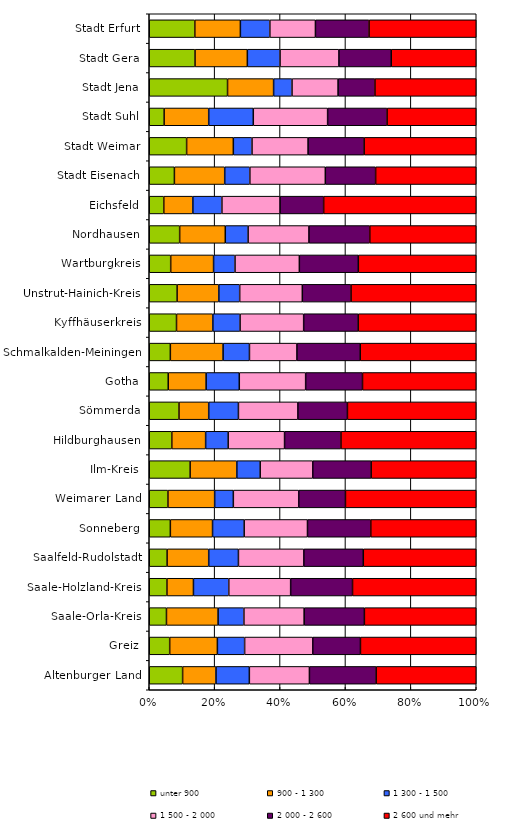
| Category | unter 900  | 900 - 1 300 | 1 300 - 1 500 | 1 500 - 2 000 | 2 000 - 2 600 | 2 600 und mehr |
|---|---|---|---|---|---|---|
| Altenburger Land | 5 | 5 | 5 | 9 | 10 | 15 |
| Greiz | 3 | 7 | 4 | 10 | 7 | 17 |
| Saale-Orla-Kreis | 2 | 6 | 3 | 7 | 7 | 13 |
| Saale-Holzland-Kreis | 2 | 3 | 4 | 7 | 7 | 14 |
| Saalfeld-Rudolstadt | 3 | 7 | 5 | 11 | 10 | 19 |
| Sonneberg | 2 | 4 | 3 | 6 | 6 | 10 |
| Weimarer Land | 2 | 5 | 2 | 7 | 5 | 14 |
| Ilm-Kreis | 7 | 8 | 4 | 9 | 10 | 18 |
| Hildburghausen | 2 | 3 | 2 | 5 | 5 | 12 |
| Sömmerda | 3 | 3 | 3 | 6 | 5 | 13 |
| Gotha | 4 | 8 | 7 | 14 | 12 | 24 |
| Schmalkalden-Meiningen | 4 | 10 | 5 | 9 | 12 | 22 |
| Kyffhäuserkreis | 3 | 4 | 3 | 7 | 6 | 13 |
| Unstrut-Hainich-Kreis | 4 | 6 | 3 | 9 | 7 | 18 |
| Wartburgkreis | 4 | 8 | 4 | 12 | 11 | 22 |
| Nordhausen | 4 | 6 | 3 | 8 | 8 | 14 |
| Eichsfeld | 2 | 4 | 4 | 8 | 6 | 21 |
| Stadt Eisenach | 2 | 4 | 2 | 6 | 4 | 8 |
| Stadt Weimar | 4 | 5 | 2 | 6 | 6 | 12 |
| Stadt Suhl | 1 | 3 | 3 | 5 | 4 | 6 |
| Stadt Jena | 17 | 10 | 4 | 10 | 8 | 22 |
| Stadt Gera | 7 | 8 | 5 | 9 | 8 | 13 |
| Stadt Erfurt | 17 | 17 | 11 | 17 | 20 | 40 |